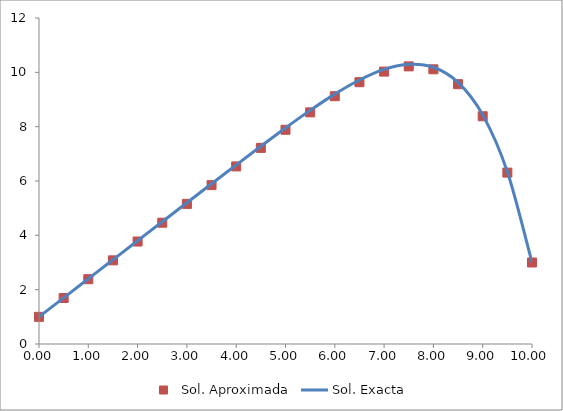
| Category | Sol. Aproximada |
|---|---|
| 0.0 | 1 |
| 0.5 | 1.693 |
| 1.0 | 2.386 |
| 1.5 | 3.079 |
| 2.0 | 3.772 |
| 2.5 | 4.465 |
| 3.0 | 5.157 |
| 3.5 | 5.849 |
| 4.0 | 6.537 |
| 4.5 | 7.218 |
| 5.0 | 7.886 |
| 5.5 | 8.527 |
| 6.0 | 9.121 |
| 6.5 | 9.637 |
| 7.0 | 10.027 |
| 7.5 | 10.219 |
| 8.0 | 10.112 |
| 8.5 | 9.564 |
| 9.0 | 8.383 |
| 9.5 | 6.309 |
| 10.0 | 3 |